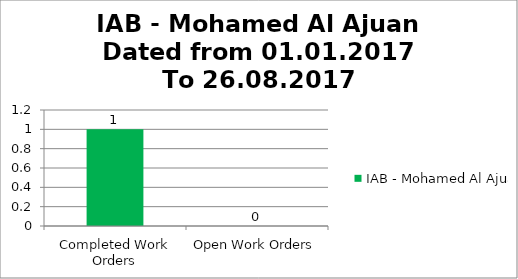
| Category | IAB - Mohamed Al Ajuan |
|---|---|
| Completed Work Orders | 1 |
| Open Work Orders | 0 |